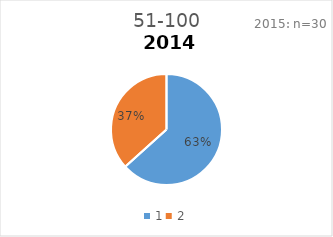
| Category | 51-100 |
|---|---|
| 0 | 0.633 |
| 1 | 0.367 |